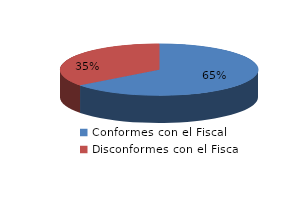
| Category | Series 0 |
|---|---|
| 0 | 11729 |
| 1 | 6419 |